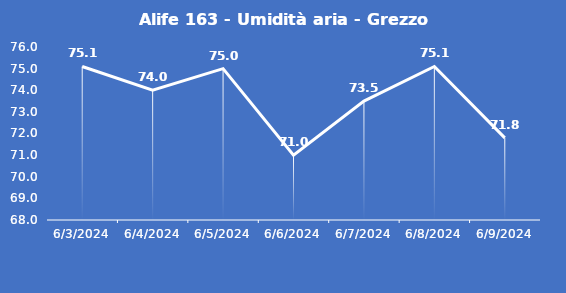
| Category | Alife 163 - Umidità aria - Grezzo (%) |
|---|---|
| 6/3/24 | 75.1 |
| 6/4/24 | 74 |
| 6/5/24 | 75 |
| 6/6/24 | 71 |
| 6/7/24 | 73.5 |
| 6/8/24 | 75.1 |
| 6/9/24 | 71.8 |